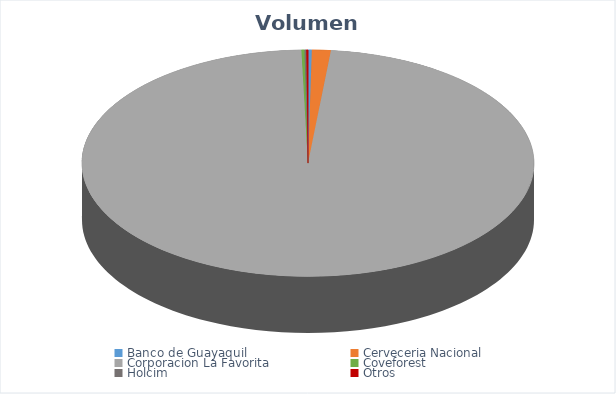
| Category | VOLUMEN ($USD) |
|---|---|
| Banco de Guayaquil | 8735.32 |
| Cerveceria Nacional | 43380 |
| Corporacion La Favorita | 3155554.6 |
| Coveforest | 7004.4 |
| Holcim | 4060.58 |
| Otros | 3929.8 |